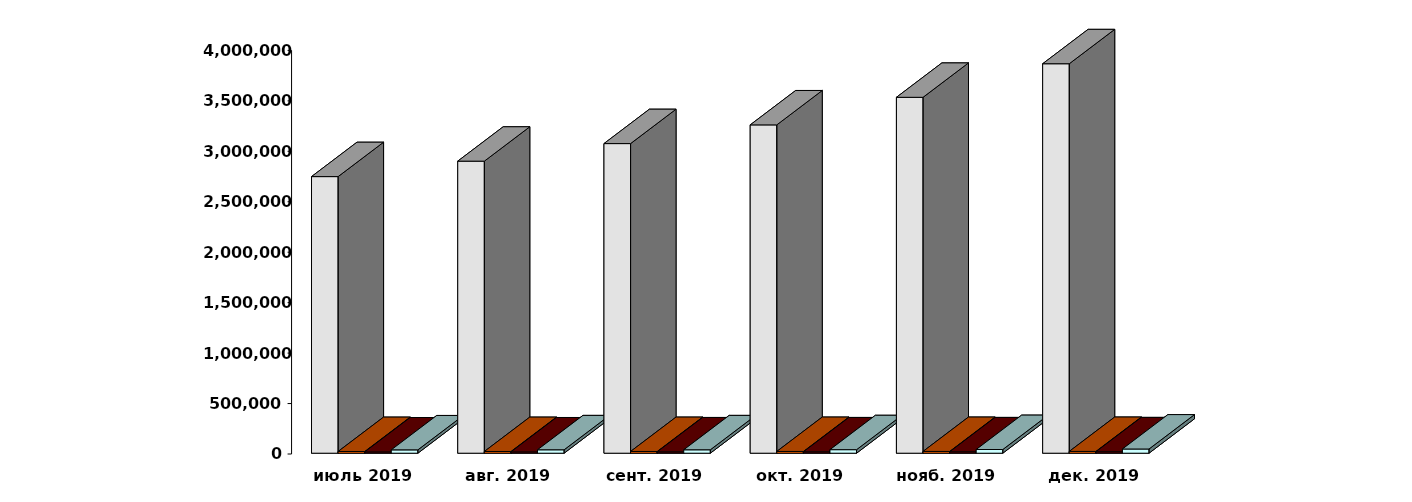
| Category | Физические лица | Юридические лица | Иностранные лица | Клиенты, передавшие свои средства в ДУ |
|---|---|---|---|---|
| 2019-07-30 | 2741361 | 16917 | 12726 | 33008 |
| 2019-08-30 | 2894450 | 17007 | 12945 | 33858 |
| 2019-09-30 | 3068547 | 17183 | 13213 | 33842 |
| 2019-10-30 | 3253953 | 17389 | 13455 | 35116 |
| 2019-11-30 | 3527188 | 17527 | 13688 | 36567 |
| 2019-12-31 | 3859911 | 17695 | 14011 | 41535 |